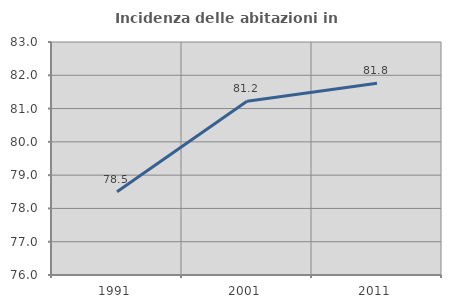
| Category | Incidenza delle abitazioni in proprietà  |
|---|---|
| 1991.0 | 78.503 |
| 2001.0 | 81.218 |
| 2011.0 | 81.759 |